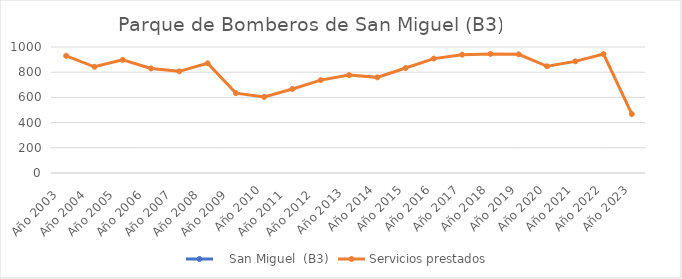
| Category |    San Miguel  (B3) | Servicios prestados  |
|---|---|---|
| Año 2003   |  | 930 |
| Año 2004   |  | 843 |
| Año 2005   |  | 898 |
| Año 2006   |  | 830 |
| Año 2007   |  | 807 |
| Año 2008   |  | 871 |
| Año 2009   |  | 634 |
| Año 2010 |  | 604 |
| Año 2011   |  | 667 |
| Año 2012   |  | 737 |
| Año 2013  |  | 777 |
| Año 2014 |  | 759 |
| Año 2015 |  | 833 |
| Año 2016 |  | 908 |
| Año 2017 |  | 939 |
| Año 2018 |  | 945 |
| Año 2019 |  | 942 |
| Año 2020 |  | 847 |
| Año 2021 |  | 886 |
| Año 2022 |  | 944 |
| Año 2023 |  | 468 |